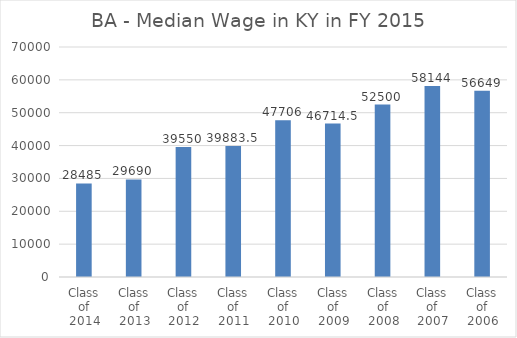
| Category | Median Wage in KY in FY 2015 |
|---|---|
| Class of 2014 | 28485 |
| Class of 2013 | 29690 |
| Class of 2012 | 39550 |
| Class of 2011 | 39883.5 |
| Class of 2010 | 47706 |
| Class of 2009 | 46714.5 |
| Class of 2008 | 52500 |
| Class of 2007 | 58144 |
| Class of 2006 | 56649 |